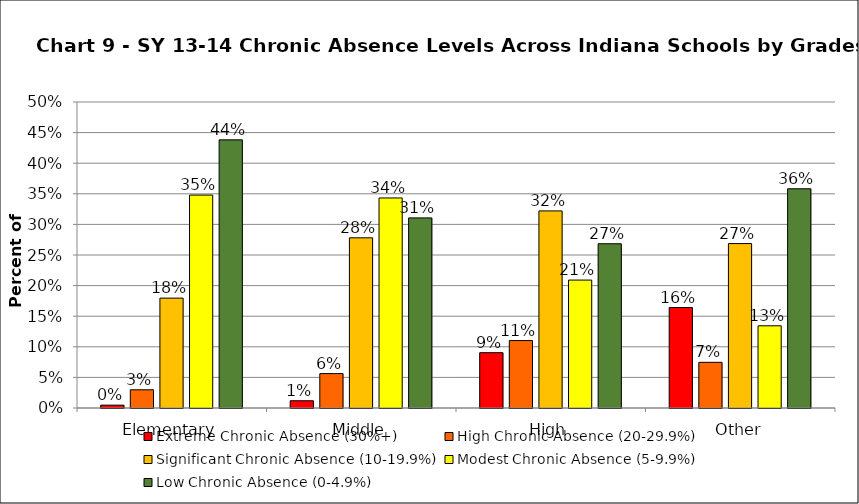
| Category | Extreme Chronic Absence (30%+) | High Chronic Absence (20-29.9%) | Significant Chronic Absence (10-19.9%) | Modest Chronic Absence (5-9.9%) | Low Chronic Absence (0-4.9%) |
|---|---|---|---|---|---|
| 0 | 0.005 | 0.03 | 0.18 | 0.348 | 0.438 |
| 1 | 0.012 | 0.056 | 0.278 | 0.343 | 0.311 |
| 2 | 0.09 | 0.11 | 0.322 | 0.209 | 0.268 |
| 3 | 0.164 | 0.075 | 0.269 | 0.134 | 0.358 |